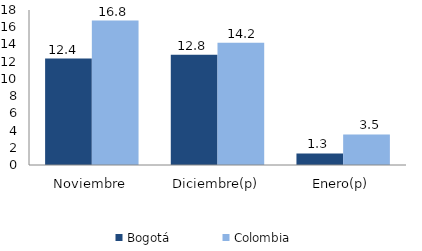
| Category | Bogotá | Colombia |
|---|---|---|
| Noviembre | 12.36 | 16.77 |
| Diciembre(p) | 12.8 | 14.2 |
| Enero(p) | 1.349 | 3.545 |